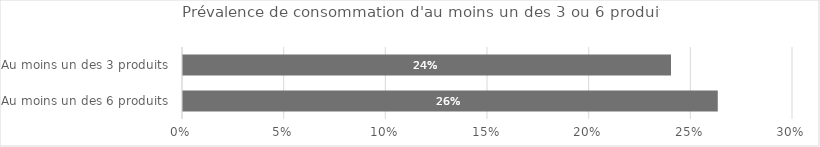
| Category | Oui |
|---|---|
| Au moins un des 3 produits  | 0.24 |
| Au moins un des 6 produits  | 0.263 |